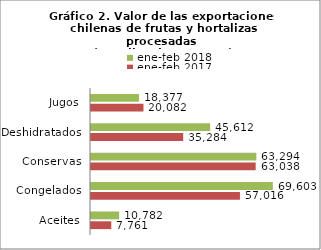
| Category | ene-feb 2017 | ene-feb 2018 |
|---|---|---|
| Aceites | 7760533.18 | 10781530.82 |
| Congelados | 57015532.27 | 69603033.98 |
| Conservas | 63037701.01 | 63294331.91 |
| Deshidratados | 35283779.15 | 45611546.92 |
| Jugos | 20082155.14 | 18376744.27 |